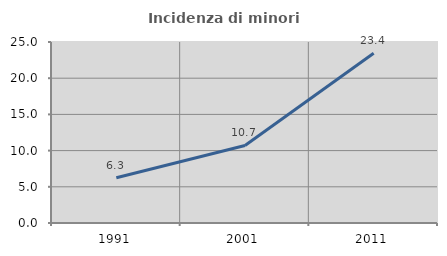
| Category | Incidenza di minori stranieri |
|---|---|
| 1991.0 | 6.25 |
| 2001.0 | 10.714 |
| 2011.0 | 23.438 |